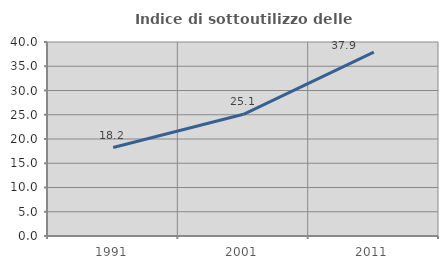
| Category | Indice di sottoutilizzo delle abitazioni  |
|---|---|
| 1991.0 | 18.244 |
| 2001.0 | 25.091 |
| 2011.0 | 37.921 |